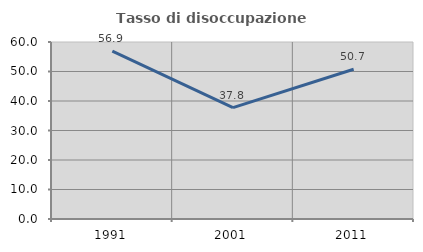
| Category | Tasso di disoccupazione giovanile  |
|---|---|
| 1991.0 | 56.881 |
| 2001.0 | 37.778 |
| 2011.0 | 50.746 |